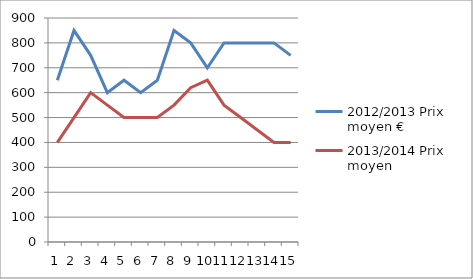
| Category | 2012/2013 Prix moyen € | 2013/2014 Prix moyen |
|---|---|---|
| 0 | 650 | 400 |
| 1 | 850 | 500 |
| 2 | 750 | 600 |
| 3 | 600 | 550 |
| 4 | 650 | 500 |
| 5 | 600 | 500 |
| 6 | 650 | 500 |
| 7 | 850 | 550 |
| 8 | 800 | 620 |
| 9 | 700 | 650 |
| 10 | 800 | 550 |
| 11 | 800 | 500 |
| 12 | 800 | 450 |
| 13 | 800 | 400 |
| 14 | 750 | 400 |